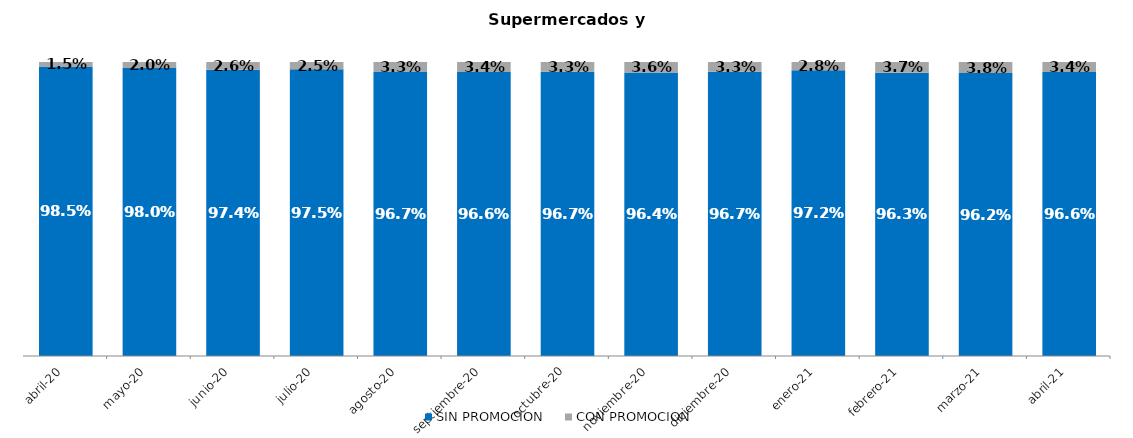
| Category | SIN PROMOCION   | CON PROMOCION   |
|---|---|---|
| 2020-04-01 | 0.985 | 0.015 |
| 2020-05-01 | 0.98 | 0.02 |
| 2020-06-01 | 0.974 | 0.026 |
| 2020-07-01 | 0.975 | 0.025 |
| 2020-08-01 | 0.967 | 0.033 |
| 2020-09-01 | 0.966 | 0.034 |
| 2020-10-01 | 0.967 | 0.033 |
| 2020-11-01 | 0.964 | 0.036 |
| 2020-12-01 | 0.967 | 0.033 |
| 2021-01-01 | 0.972 | 0.028 |
| 2021-02-01 | 0.963 | 0.037 |
| 2021-03-01 | 0.962 | 0.038 |
| 2021-04-01 | 0.966 | 0.034 |